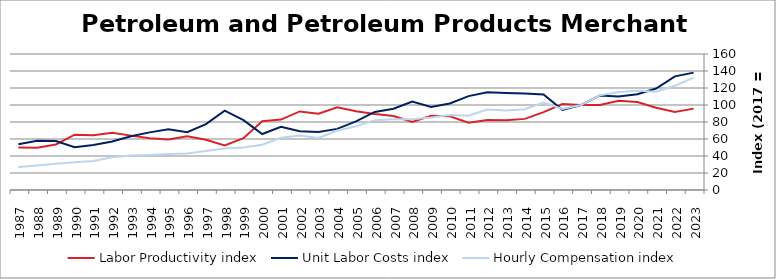
| Category | Labor Productivity index | Unit Labor Costs index | Hourly Compensation index |
|---|---|---|---|
| 2023.0 | 95.738 | 138.106 | 132.22 |
| 2022.0 | 91.725 | 133.655 | 122.596 |
| 2021.0 | 96.853 | 119.376 | 115.62 |
| 2020.0 | 103.614 | 112.762 | 116.837 |
| 2019.0 | 104.978 | 109.919 | 115.39 |
| 2018.0 | 100.076 | 111.267 | 111.352 |
| 2017.0 | 100 | 100 | 100 |
| 2016.0 | 101.19 | 94.301 | 95.424 |
| 2015.0 | 91.67 | 112.376 | 103.015 |
| 2014.0 | 83.663 | 113.526 | 94.98 |
| 2013.0 | 82.043 | 113.985 | 93.517 |
| 2012.0 | 82.433 | 114.88 | 94.699 |
| 2011.0 | 79.203 | 110.452 | 87.481 |
| 2010.0 | 86.689 | 101.837 | 88.282 |
| 2009.0 | 87.29 | 97.643 | 85.232 |
| 2008.0 | 79.968 | 104.132 | 83.273 |
| 2007.0 | 87.109 | 95.598 | 83.274 |
| 2006.0 | 89.505 | 91.802 | 82.167 |
| 2005.0 | 92.685 | 80.813 | 74.901 |
| 2004.0 | 97.404 | 71.879 | 70.013 |
| 2003.0 | 89.744 | 68.338 | 61.33 |
| 2002.0 | 92.466 | 69.22 | 64.005 |
| 2001.0 | 82.822 | 74.285 | 61.524 |
| 2000.0 | 80.997 | 65.852 | 53.338 |
| 1999.0 | 60.929 | 82.097 | 50.021 |
| 1998.0 | 52.463 | 93.277 | 48.936 |
| 1997.0 | 59.126 | 77.577 | 45.868 |
| 1996.0 | 63.245 | 68.025 | 43.023 |
| 1995.0 | 59.511 | 71.379 | 42.478 |
| 1994.0 | 60.953 | 67.781 | 41.315 |
| 1993.0 | 63.969 | 63.234 | 40.45 |
| 1992.0 | 67.426 | 57.123 | 38.516 |
| 1991.0 | 64.549 | 52.879 | 34.133 |
| 1990.0 | 65.029 | 50.316 | 32.72 |
| 1989.0 | 53.627 | 57.647 | 30.914 |
| 1988.0 | 49.823 | 57.821 | 28.808 |
| 1987.0 | 49.956 | 53.939 | 26.946 |